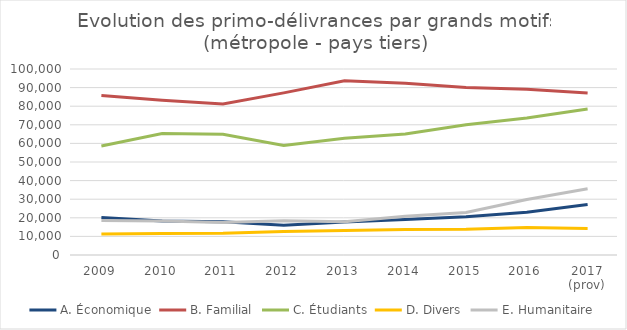
| Category | A. Économique | B. Familial | C. Étudiants | D. Divers | E. Humanitaire |
|---|---|---|---|---|---|
| 2009 | 20185 | 85715 | 58586 | 11343 | 18581 |
| 2010 | 18280 | 83182 | 65281 | 11572 | 18220 |
| 2011 | 17834 | 81172 | 64928 | 11633 | 17487 |
| 2012 | 16013 | 87170 | 58857 | 12624 | 18456 |
| 2013 | 17800 | 93714 | 62815 | 13148 | 17916 |
| 2014 | 19054 | 92326 | 64996 | 13742 | 20822 |
| 2015 | 20628 | 90113 | 70023 | 13866 | 22903 |
| 2016 | 22982 | 89124 | 73644 | 14741 | 29862 |
| 2017 (prov) | 27209 | 87109 | 78478 | 14265 | 35604 |